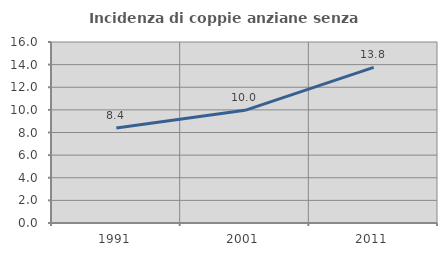
| Category | Incidenza di coppie anziane senza figli  |
|---|---|
| 1991.0 | 8.4 |
| 2001.0 | 9.963 |
| 2011.0 | 13.751 |